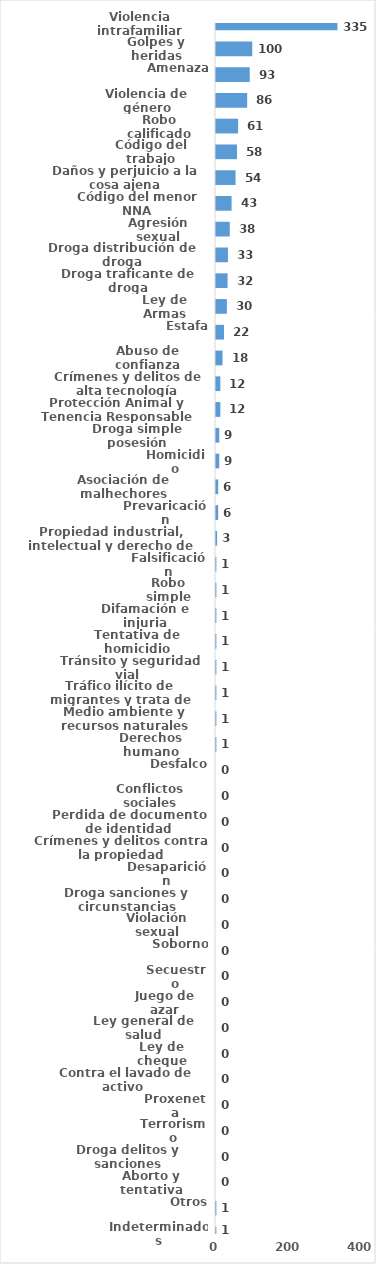
| Category | Series 0 |
|---|---|
| Violencia intrafamiliar | 335 |
| Golpes y heridas | 100 |
| Amenaza | 93 |
| Violencia de género | 86 |
| Robo calificado | 61 |
| Código del trabajo | 58 |
| Daños y perjuicio a la cosa ajena | 54 |
| Código del menor NNA | 43 |
| Agresión sexual | 38 |
| Droga distribución de droga | 33 |
| Droga traficante de droga | 32 |
| Ley de Armas | 30 |
| Estafa | 22 |
| Abuso de confianza | 18 |
| Crímenes y delitos de alta tecnología | 12 |
| Protección Animal y Tenencia Responsable | 12 |
| Droga simple posesión | 9 |
| Homicidio | 9 |
| Asociación de malhechores | 6 |
| Prevaricación | 6 |
| Propiedad industrial, intelectual y derecho de autor | 3 |
| Falsificación | 1 |
| Robo simple | 1 |
| Difamación e injuria | 1 |
| Tentativa de homicidio | 1 |
| Tránsito y seguridad vial  | 1 |
| Tráfico ilícito de migrantes y trata de personas | 1 |
| Medio ambiente y recursos naturales | 1 |
| Derechos humano | 1 |
| Desfalco | 0 |
| Conflictos sociales | 0 |
| Perdida de documento de identidad | 0 |
| Crímenes y delitos contra la propiedad | 0 |
| Desaparición | 0 |
| Droga sanciones y circunstancias agravantes | 0 |
| Violación sexual | 0 |
| Soborno | 0 |
| Secuestro | 0 |
| Juego de azar | 0 |
| Ley general de salud | 0 |
| Ley de cheque | 0 |
| Contra el lavado de activo  | 0 |
| Proxeneta | 0 |
| Terrorismo | 0 |
| Droga delitos y sanciones | 0 |
| Aborto y tentativa | 0 |
| Otros | 1 |
| Indeterminados | 1 |